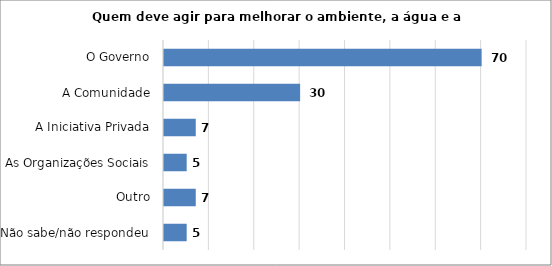
| Category | Series 0 |
|---|---|
| Não sabe/não respondeu | 5 |
| Outro | 7 |
| As Organizações Sociais | 5 |
| A Iniciativa Privada | 7 |
| A Comunidade | 30 |
| O Governo | 70 |